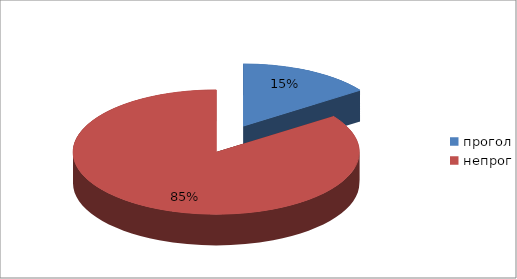
| Category | Series 0 |
|---|---|
| прогол | 64 |
| непрог | 357 |